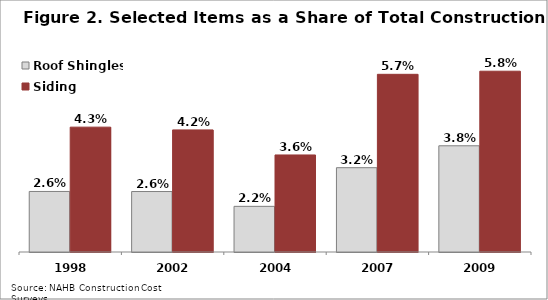
| Category | Roof Shingles | Siding |
|---|---|---|
| 1998.0 | 0.026 | 0.043 |
| 2002.0 | 0.026 | 0.042 |
| 2004.0 | 0.022 | 0.036 |
| 2007.0 | 0.032 | 0.057 |
| 2009.0 | 0.038 | 0.058 |